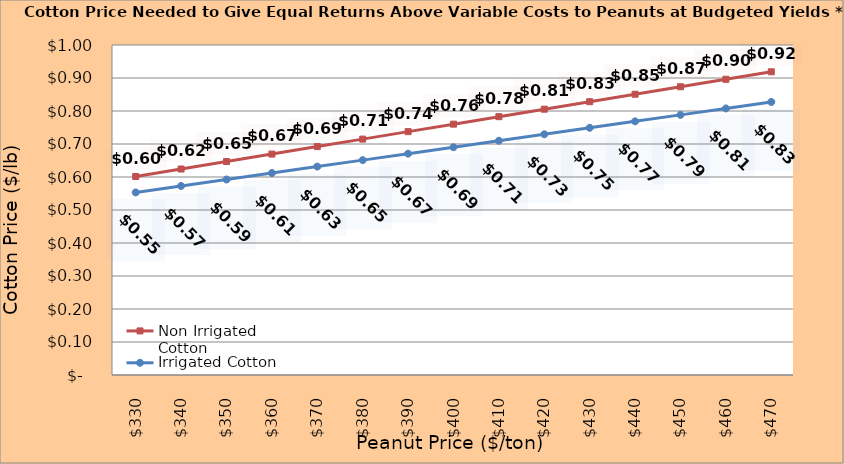
| Category | Non Irrigated Cotton | Irrigated Cotton |
|---|---|---|
| 330.0 | 0.601 | 0.553 |
| 340.0 | 0.624 | 0.573 |
| 350.0 | 0.647 | 0.592 |
| 360.0 | 0.669 | 0.612 |
| 370.0 | 0.692 | 0.632 |
| 380.0 | 0.715 | 0.651 |
| 390.0 | 0.737 | 0.671 |
| 400.0 | 0.76 | 0.69 |
| 410.0 | 0.783 | 0.71 |
| 420.0 | 0.805 | 0.729 |
| 430.0 | 0.828 | 0.749 |
| 440.0 | 0.851 | 0.769 |
| 450.0 | 0.873 | 0.788 |
| 460.0 | 0.896 | 0.808 |
| 470.0 | 0.919 | 0.827 |